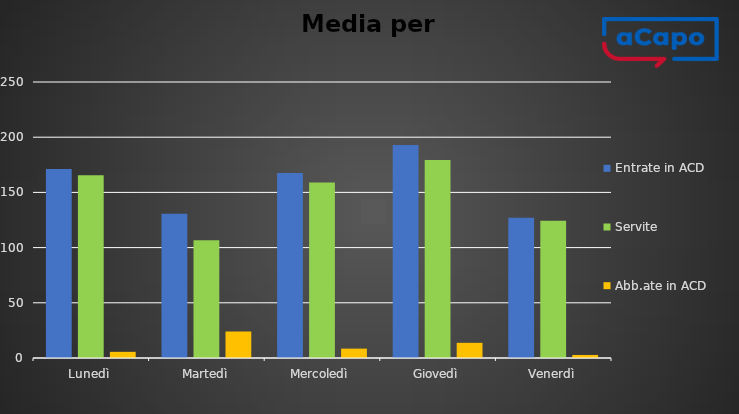
| Category | Entrate in ACD | Servite | Abb.ate in ACD |
|---|---|---|---|
| Lunedì | 171.2 | 165.6 | 5.6 |
| Martedì | 130.75 | 106.75 | 24 |
| Mercoledì | 167.5 | 159 | 8.5 |
| Giovedì | 193 | 179.25 | 13.75 |
| Venerdì | 127 | 124.25 | 2.75 |